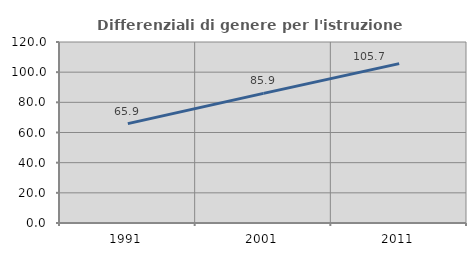
| Category | Differenziali di genere per l'istruzione superiore |
|---|---|
| 1991.0 | 65.904 |
| 2001.0 | 85.924 |
| 2011.0 | 105.684 |